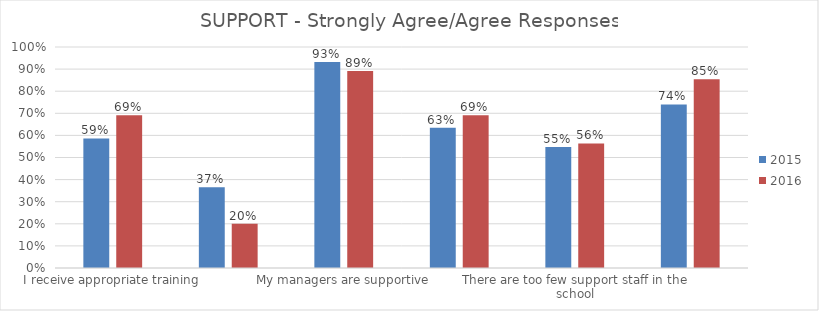
| Category | 2015 | 2016 |
|---|---|---|
| I receive appropriate training | 0.587 | 0.691 |
| I do not have enough support in dealing with bureaucratic paperwork | 0.365 | 0.2 |
| My managers are supportive | 0.933 | 0.891 |
| I regularly receive positive feedback on my work | 0.635 | 0.691 |
| There are too few support staff in the school | 0.548 | 0.564 |
| The school benefits from effective leadership | 0.74 | 0.855 |